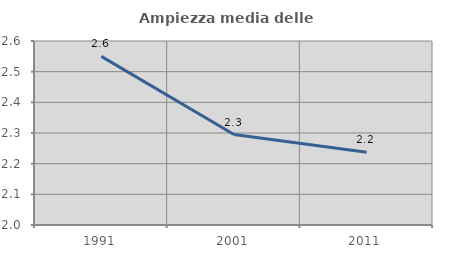
| Category | Ampiezza media delle famiglie |
|---|---|
| 1991.0 | 2.55 |
| 2001.0 | 2.295 |
| 2011.0 | 2.237 |